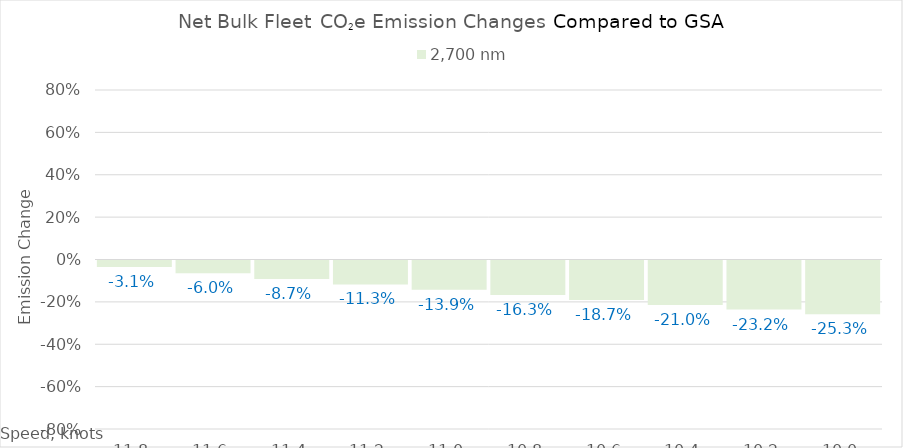
| Category | 2,700 |
|---|---|
| 11.8 | -0.031 |
| 11.600000000000001 | -0.06 |
| 11.400000000000002 | -0.087 |
| 11.200000000000003 | -0.113 |
| 11.000000000000004 | -0.139 |
| 10.800000000000004 | -0.163 |
| 10.600000000000005 | -0.187 |
| 10.400000000000006 | -0.21 |
| 10.200000000000006 | -0.232 |
| 10.000000000000007 | -0.253 |